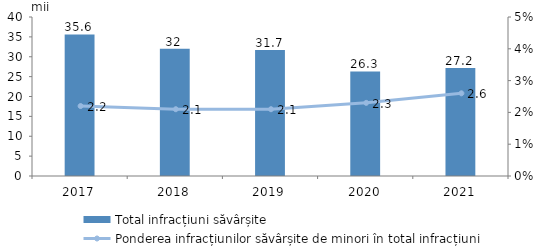
| Category | Total infracțiuni săvârșite |
|---|---|
| 2017.0 | 35.6 |
| 2018.0 | 32 |
| 2019.0 | 31.7 |
| 2020.0 | 26.3 |
| 2021.0 | 27.2 |